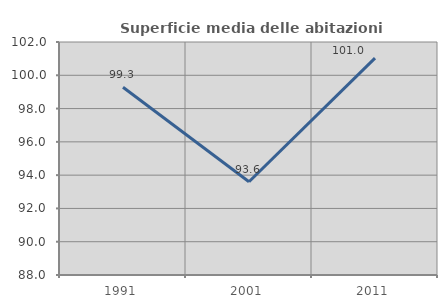
| Category | Superficie media delle abitazioni occupate |
|---|---|
| 1991.0 | 99.282 |
| 2001.0 | 93.604 |
| 2011.0 | 101.034 |